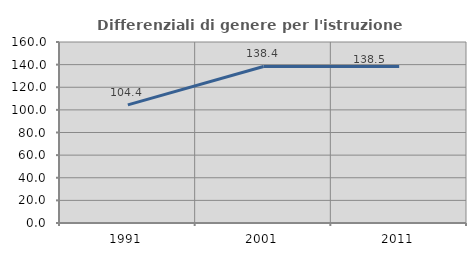
| Category | Differenziali di genere per l'istruzione superiore |
|---|---|
| 1991.0 | 104.419 |
| 2001.0 | 138.378 |
| 2011.0 | 138.452 |